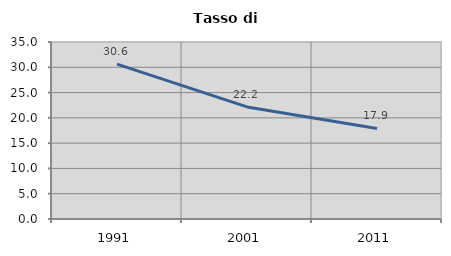
| Category | Tasso di disoccupazione   |
|---|---|
| 1991.0 | 30.623 |
| 2001.0 | 22.165 |
| 2011.0 | 17.896 |